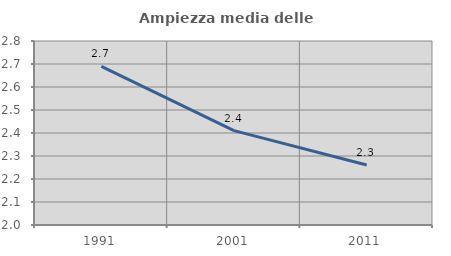
| Category | Ampiezza media delle famiglie |
|---|---|
| 1991.0 | 2.69 |
| 2001.0 | 2.41 |
| 2011.0 | 2.261 |